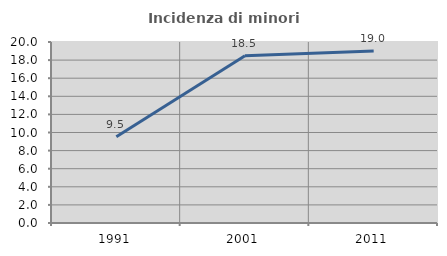
| Category | Incidenza di minori stranieri |
|---|---|
| 1991.0 | 9.524 |
| 2001.0 | 18.478 |
| 2011.0 | 19.018 |